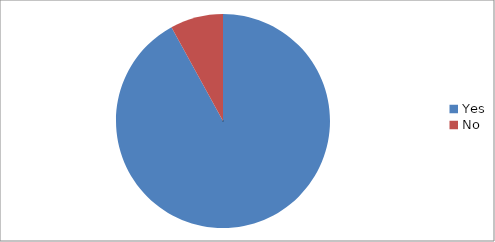
| Category | Series 0 |
|---|---|
| Yes | 23 |
| No | 2 |